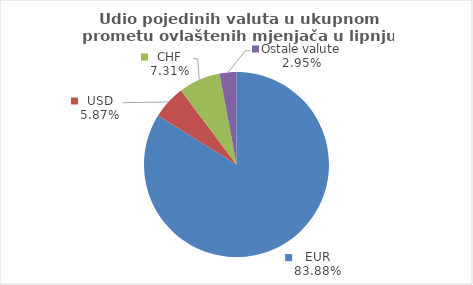
| Category | Series 0 |
|---|---|
| EUR | 83.88 |
| USD | 5.868 |
| CHF | 7.302 |
| Ostale valute | 2.95 |